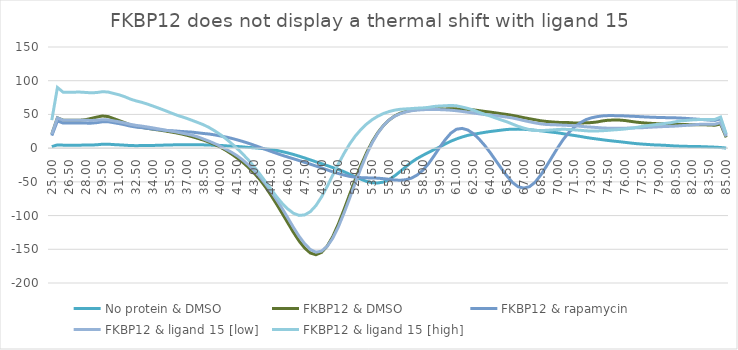
| Category | No protein & DMSO | FKBP12 & DMSO | FKBP12 & rapamycin | FKBP12 & ligand 15 [low] | FKBP12 & ligand 15 [high] |
|---|---|---|---|---|---|
| 25.0 | 2.229 | 20.756 | 18.619 | 20.726 | 41.527 |
| 25.5 | 4.83 | 44.971 | 40.341 | 44.905 | 89.975 |
| 26.0 | 4.459 | 41.512 | 37.238 | 41.451 | 83.054 |
| 26.5 | 4.459 | 41.512 | 37.238 | 41.451 | 83.054 |
| 27.0 | 4.459 | 41.512 | 37.238 | 41.451 | 83.054 |
| 27.5 | 4.444 | 41.368 | 37.255 | 41.475 | 83.128 |
| 28.0 | 4.54 | 42.227 | 37.111 | 41.307 | 82.611 |
| 28.5 | 4.622 | 44.091 | 37.067 | 41.093 | 82.05 |
| 29.0 | 4.979 | 46.03 | 37.791 | 41.368 | 82.482 |
| 29.5 | 5.799 | 47.682 | 39.107 | 42.225 | 83.682 |
| 30.0 | 5.893 | 46.882 | 39.167 | 41.91 | 83.253 |
| 30.5 | 5.268 | 43.839 | 37.75 | 40.412 | 81.109 |
| 31.0 | 4.851 | 40.812 | 36.301 | 39.03 | 79.067 |
| 31.5 | 4.393 | 37.689 | 34.624 | 37.322 | 76.173 |
| 32.0 | 3.839 | 34.352 | 32.594 | 35.288 | 72.685 |
| 32.5 | 3.681 | 32.057 | 31.222 | 33.767 | 70.045 |
| 33.0 | 3.802 | 30.821 | 30.437 | 32.712 | 67.998 |
| 33.5 | 3.832 | 29.454 | 29.368 | 31.423 | 65.341 |
| 34.0 | 4.001 | 28.075 | 28.347 | 30.018 | 62.416 |
| 34.5 | 4.275 | 26.916 | 27.445 | 28.564 | 59.38 |
| 35.0 | 4.507 | 25.679 | 26.491 | 27.011 | 56.226 |
| 35.5 | 4.725 | 24.292 | 25.871 | 25.553 | 52.951 |
| 36.0 | 4.938 | 22.815 | 25.45 | 24.159 | 49.674 |
| 36.5 | 5.097 | 21.144 | 24.773 | 22.522 | 46.887 |
| 37.0 | 5.047 | 19.172 | 24.22 | 20.864 | 44.172 |
| 37.5 | 4.974 | 16.93 | 23.697 | 19.132 | 41.098 |
| 38.0 | 5.003 | 14.482 | 22.72 | 16.635 | 37.928 |
| 38.5 | 4.861 | 11.869 | 21.74 | 13.451 | 34.636 |
| 39.0 | 4.559 | 8.842 | 20.928 | 10.262 | 30.528 |
| 39.5 | 4.316 | 5.299 | 19.638 | 6.681 | 25.558 |
| 40.0 | 4.038 | 1.295 | 18.045 | 2.569 | 20.048 |
| 40.5 | 3.438 | -3.367 | 16.469 | -1.688 | 13.81 |
| 41.0 | 2.902 | -8.805 | 14.525 | -6.251 | 6.785 |
| 41.5 | 2.49 | -14.704 | 12.252 | -11.486 | -0.791 |
| 42.0 | 1.807 | -21.19 | 9.866 | -17.742 | -8.868 |
| 42.5 | 1.038 | -28.565 | 7.218 | -25.033 | -17.713 |
| 43.0 | 0.541 | -36.93 | 4.335 | -33.131 | -27.602 |
| 43.5 | -0.14 | -46.424 | 1.366 | -42.242 | -38.287 |
| 44.0 | -1.158 | -57.453 | -1.776 | -52.688 | -49.443 |
| 44.5 | -2.082 | -69.811 | -4.837 | -64.044 | -60.866 |
| 45.0 | -3.345 | -83.089 | -7.723 | -76.358 | -72.072 |
| 45.5 | -5.16 | -96.832 | -10.61 | -89.616 | -81.968 |
| 46.0 | -7.154 | -110.918 | -13.26 | -103.507 | -90.26 |
| 46.5 | -9.38 | -124.925 | -15.763 | -117.62 | -96.59 |
| 47.0 | -11.919 | -137.674 | -18.398 | -130.761 | -99.734 |
| 47.5 | -14.573 | -148.147 | -21.049 | -141.845 | -99.003 |
| 48.0 | -17.427 | -155.521 | -23.681 | -150.253 | -94.206 |
| 48.5 | -20.297 | -158.083 | -26.508 | -154.319 | -85.204 |
| 49.0 | -22.972 | -154.548 | -29.398 | -152.653 | -72.334 |
| 49.5 | -25.863 | -145.311 | -32.246 | -145.649 | -56.799 |
| 50.0 | -28.851 | -130.963 | -35.093 | -133.442 | -39.915 |
| 50.5 | -31.672 | -112.298 | -37.615 | -116.501 | -23.318 |
| 51.0 | -34.962 | -91.052 | -39.972 | -96.241 | -7.815 |
| 51.5 | -38.821 | -68.696 | -41.887 | -74.149 | 6.142 |
| 52.0 | -42.542 | -46.537 | -43.088 | -51.552 | 17.904 |
| 52.5 | -46.047 | -25.716 | -43.722 | -29.789 | 27.589 |
| 53.0 | -49.295 | -6.946 | -44.069 | -9.593 | 35.634 |
| 53.5 | -51.322 | 9.398 | -44.201 | 7.943 | 42.17 |
| 54.0 | -51.685 | 22.876 | -44.546 | 22.136 | 47.302 |
| 54.5 | -50.279 | 33.46 | -45.251 | 33.278 | 51.309 |
| 55.0 | -46.733 | 41.583 | -46.189 | 41.615 | 54.237 |
| 55.5 | -41.184 | 47.651 | -47.231 | 47.328 | 56.343 |
| 56.0 | -34.566 | 51.761 | -47.604 | 51.118 | 57.643 |
| 56.5 | -27.541 | 54.294 | -46.821 | 53.725 | 58.19 |
| 57.0 | -20.929 | 56.094 | -44.479 | 55.451 | 58.692 |
| 57.5 | -15.403 | 57.229 | -39.932 | 56.463 | 59.282 |
| 58.0 | -10.773 | 57.674 | -32.986 | 56.996 | 59.671 |
| 58.5 | -6.494 | 57.933 | -23.463 | 57.372 | 60.428 |
| 59.0 | -2.387 | 58.228 | -11.635 | 57.429 | 61.808 |
| 59.5 | 1.737 | 58.257 | 0.887 | 57.164 | 62.514 |
| 60.0 | 6.124 | 58.224 | 12.483 | 56.808 | 62.825 |
| 60.5 | 10.262 | 58.308 | 22.184 | 56.279 | 63.377 |
| 61.0 | 13.637 | 58.275 | 28.027 | 55.469 | 62.816 |
| 61.5 | 16.485 | 57.917 | 29.283 | 54.438 | 60.92 |
| 62.0 | 18.961 | 57.453 | 26.984 | 53.235 | 58.976 |
| 62.5 | 20.633 | 56.758 | 21.612 | 52.118 | 56.52 |
| 63.0 | 21.939 | 55.638 | 13.751 | 50.978 | 53.197 |
| 63.5 | 23.366 | 54.48 | 4.296 | 49.802 | 50.317 |
| 64.0 | 24.645 | 53.443 | -6.558 | 49.035 | 47.628 |
| 64.5 | 25.66 | 52.276 | -18.451 | 48.283 | 44.611 |
| 65.0 | 26.742 | 51.05 | -30.172 | 47.142 | 41.735 |
| 65.5 | 27.702 | 49.883 | -41.444 | 45.995 | 38.927 |
| 66.0 | 28.145 | 48.543 | -51.151 | 44.729 | 35.602 |
| 66.5 | 28.209 | 46.901 | -57.299 | 42.861 | 32.327 |
| 67.0 | 27.922 | 45.198 | -59.207 | 40.872 | 29.667 |
| 67.5 | 27.33 | 43.608 | -57.144 | 39.08 | 27.495 |
| 68.0 | 26.585 | 42.092 | -50.586 | 37.384 | 26.108 |
| 68.5 | 25.771 | 40.599 | -39.949 | 35.996 | 25.945 |
| 69.0 | 24.72 | 39.6 | -27.023 | 35.104 | 26.435 |
| 69.5 | 23.698 | 38.871 | -13.261 | 34.742 | 26.971 |
| 70.0 | 22.733 | 38.268 | 0.343 | 34.434 | 27.622 |
| 70.5 | 21.406 | 38.008 | 12.819 | 34.037 | 27.992 |
| 71.0 | 19.992 | 37.878 | 23.21 | 33.655 | 27.663 |
| 71.5 | 18.754 | 37.335 | 31.292 | 33.23 | 27.098 |
| 72.0 | 17.431 | 37.226 | 37.48 | 32.481 | 26.517 |
| 72.5 | 15.931 | 37.577 | 42.084 | 31.658 | 25.739 |
| 73.0 | 14.641 | 37.897 | 44.929 | 31.127 | 25.336 |
| 73.5 | 13.571 | 38.769 | 46.662 | 30.574 | 25.479 |
| 74.0 | 12.446 | 40.392 | 47.828 | 29.92 | 25.828 |
| 74.5 | 11.363 | 41.415 | 48.276 | 29.596 | 26.401 |
| 75.0 | 10.415 | 41.657 | 48.232 | 29.656 | 27.088 |
| 75.5 | 9.562 | 41.632 | 48.07 | 29.568 | 27.667 |
| 76.0 | 8.593 | 40.961 | 47.801 | 29.556 | 28.424 |
| 76.5 | 7.601 | 39.753 | 47.378 | 29.899 | 29.465 |
| 77.0 | 6.712 | 38.581 | 47.004 | 30.106 | 30.689 |
| 77.5 | 6.035 | 37.696 | 46.524 | 30.298 | 32.204 |
| 78.0 | 5.477 | 37.077 | 46.118 | 30.758 | 33.42 |
| 78.5 | 4.899 | 36.582 | 45.771 | 31.216 | 34.408 |
| 79.0 | 4.575 | 36.147 | 45.509 | 31.628 | 35.511 |
| 79.5 | 4.275 | 35.983 | 45.287 | 32.047 | 36.501 |
| 80.0 | 3.702 | 35.708 | 45.129 | 32.314 | 37.528 |
| 80.5 | 3.137 | 35.219 | 44.933 | 32.704 | 39.119 |
| 81.0 | 2.892 | 34.944 | 44.557 | 33.302 | 40.499 |
| 81.5 | 2.65 | 34.939 | 44.062 | 33.827 | 41.212 |
| 82.0 | 2.417 | 34.7 | 43.464 | 34.51 | 41.923 |
| 82.5 | 2.321 | 34.561 | 42.806 | 35.182 | 42.351 |
| 83.0 | 2.182 | 34.723 | 42.279 | 35.502 | 42.386 |
| 83.5 | 1.748 | 34.32 | 41.579 | 35.472 | 42.397 |
| 84.0 | 1.454 | 33.997 | 41.148 | 35.469 | 42.6 |
| 84.5 | 0.935 | 35.795 | 43.602 | 37.971 | 46.081 |
| 85.0 | 0.139 | 15.972 | 19.658 | 17.287 | 21.197 |